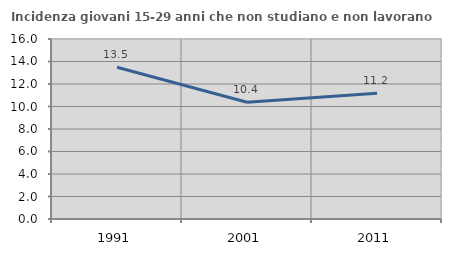
| Category | Incidenza giovani 15-29 anni che non studiano e non lavorano  |
|---|---|
| 1991.0 | 13.487 |
| 2001.0 | 10.372 |
| 2011.0 | 11.18 |